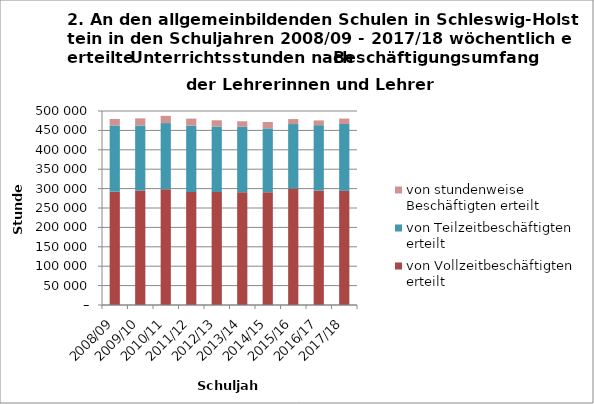
| Category | von Vollzeitbeschäftigten erteilt | von Teilzeitbeschäftigten erteilt | von stundenweise Beschäftigten erteilt |
|---|---|---|---|
| 2008/09 | 291959 | 170734 | 16797 |
| 2009/10 | 295146 | 167277 | 18723 |
| 2010/11 | 298224 | 170653 | 18597 |
| 2011/12 | 291177 | 170913 | 18338 |
| 2012/13 | 291267 | 168686 | 16162 |
| 2013/14 | 290577 | 168692 | 14261 |
| 2014/15 | 290801 | 164501.7 | 16418.7 |
| 2015/16 | 300119.6 | 166226.1 | 12878 |
| 2016/17 | 295257.4 | 168229.5 | 12256.9 |
| 2017/18 | 294217.4 | 172241.3 | 13955.2 |